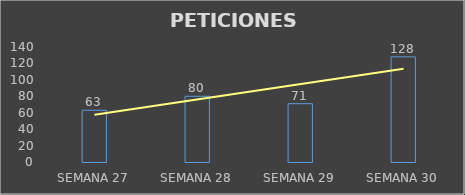
| Category | Series 0 |
|---|---|
| SEMANA 27 | 63 |
| SEMANA 28 | 80 |
| SEMANA 29 | 71 |
| SEMANA 30 | 128 |